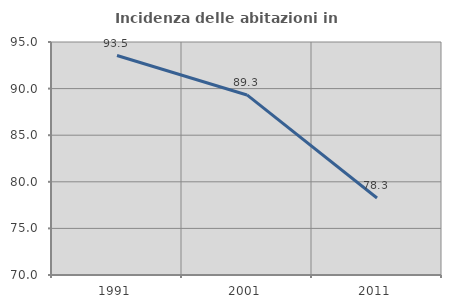
| Category | Incidenza delle abitazioni in proprietà  |
|---|---|
| 1991.0 | 93.548 |
| 2001.0 | 89.319 |
| 2011.0 | 78.264 |